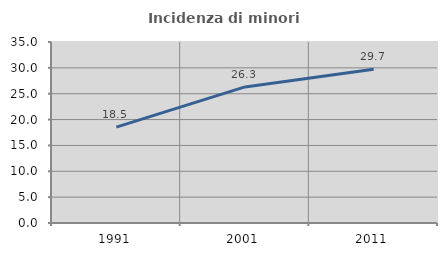
| Category | Incidenza di minori stranieri |
|---|---|
| 1991.0 | 18.548 |
| 2001.0 | 26.316 |
| 2011.0 | 29.716 |